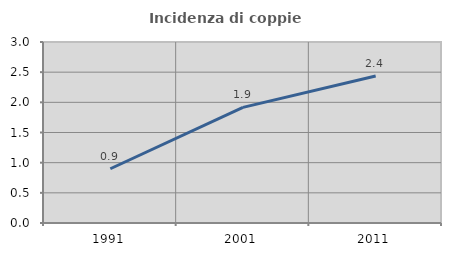
| Category | Incidenza di coppie miste |
|---|---|
| 1991.0 | 0.899 |
| 2001.0 | 1.917 |
| 2011.0 | 2.438 |